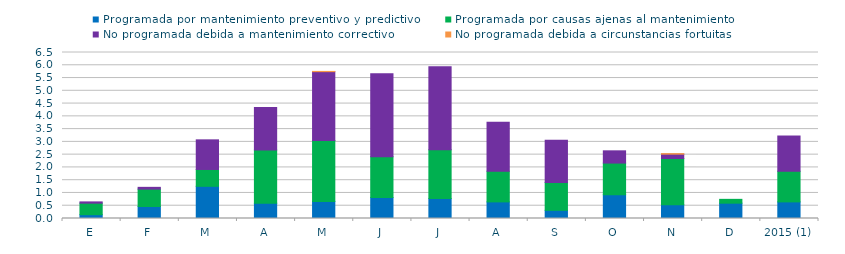
| Category | Programada por mantenimiento preventivo y predictivo | Programada por causas ajenas al mantenimiento  | No programada debida a mantenimiento correctivo  | No programada debida a circunstancias fortuitas  |
|---|---|---|---|---|
| E | 0.15 | 0.45 | 0.05 | 0 |
| F | 0.47 | 0.68 | 0.07 | 0 |
| M | 1.26 | 0.66 | 1.16 | 0 |
| A | 0.6 | 2.08 | 1.67 | 0 |
| M | 0.67 | 2.38 | 2.7 | 0.01 |
| J | 0.82 | 1.6 | 3.25 | 0 |
| J | 0.78 | 1.91 | 3.25 | 0 |
| A | 0.65 | 1.2 | 1.92 | 0 |
| S | 0.32 | 1.09 | 1.65 | 0 |
| O | 0.93 | 1.24 | 0.48 | 0 |
| N | 0.54 | 1.81 | 0.17 | 0.02 |
| D | 0.6 | 0.15 | 0 | 0 |
| 2015 (1) | 0.65 | 1.2 | 1.38 | 0 |